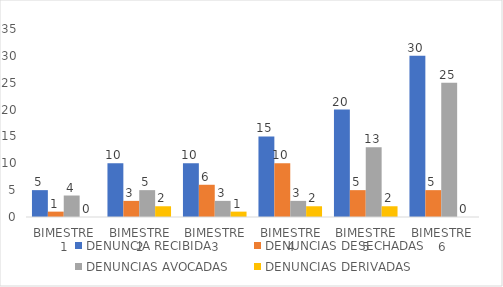
| Category | DENUNCIA RECIBIDA | DENUNCIAS DESECHADAS | DENUNCIAS AVOCADAS | DENUNCIAS DERIVADAS |
|---|---|---|---|---|
| BIMESTRE 1 | 5 | 1 | 4 | 0 |
| BIMESTRE 2 | 10 | 3 | 5 | 2 |
| BIMESTRE 3 | 10 | 6 | 3 | 1 |
| BIMESTRE 4 | 15 | 10 | 3 | 2 |
| BIMESTRE 5 | 20 | 5 | 13 | 2 |
| BIMESTRE 6 | 30 | 5 | 25 | 0 |